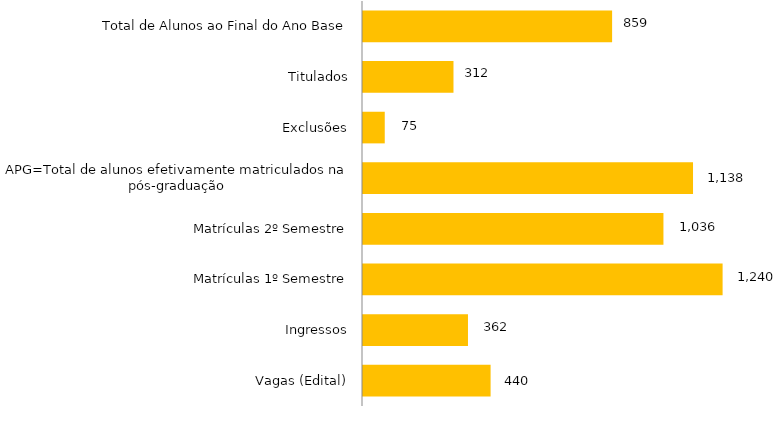
| Category | Curso |
|---|---|
| Vagas (Edital) | 440 |
| Ingressos | 362 |
| Matrículas 1º Semestre | 1240 |
| Matrículas 2º Semestre | 1036 |
| APG=Total de alunos efetivamente matriculados na pós-graduação | 1138 |
| Exclusões | 75 |
| Titulados | 312 |
| Total de Alunos ao Final do Ano Base | 859 |